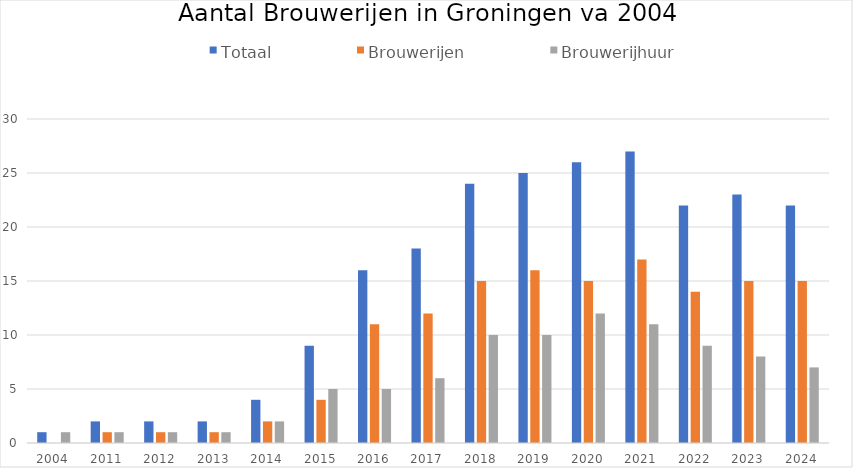
| Category | Totaal | Brouwerijen | Brouwerijhuurders |
|---|---|---|---|
| 2004.0 | 1 | 0 | 1 |
| 2011.0 | 2 | 1 | 1 |
| 2012.0 | 2 | 1 | 1 |
| 2013.0 | 2 | 1 | 1 |
| 2014.0 | 4 | 2 | 2 |
| 2015.0 | 9 | 4 | 5 |
| 2016.0 | 16 | 11 | 5 |
| 2017.0 | 18 | 12 | 6 |
| 2018.0 | 24 | 15 | 10 |
| 2019.0 | 25 | 16 | 10 |
| 2020.0 | 26 | 15 | 12 |
| 2021.0 | 27 | 17 | 11 |
| 2022.0 | 22 | 14 | 9 |
| 2023.0 | 23 | 15 | 8 |
| 2024.0 | 22 | 15 | 7 |